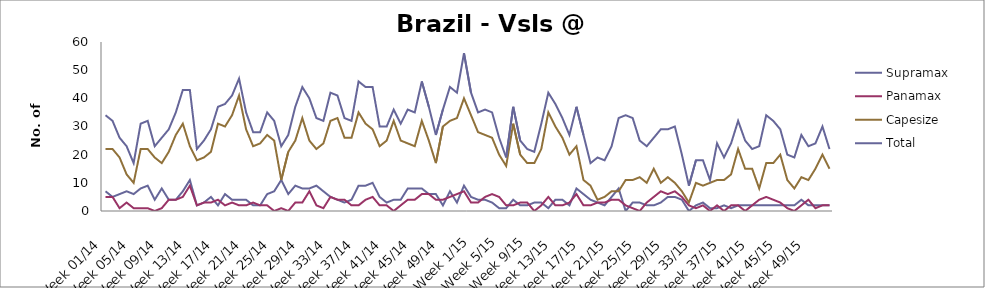
| Category | Supramax | Panamax | Capesize | Total |
|---|---|---|---|---|
| Week 01/14 | 7 | 5 | 22 | 34 |
| Week 02/14 | 5 | 5 | 22 | 32 |
| Week 03/14 | 6 | 1 | 19 | 26 |
| Week 04/14 | 7 | 3 | 13 | 23 |
| Week 05/14 | 6 | 1 | 10 | 17 |
| Week 06/14 | 8 | 1 | 22 | 31 |
| Week 07/14 | 9 | 1 | 22 | 32 |
| Week 08/14 | 4 | 0 | 19 | 23 |
| Week 09/14 | 8 | 1 | 17 | 26 |
| Week 10/14 | 4 | 4 | 21 | 29 |
| Week 11/14 | 4 | 4 | 27 | 35 |
| Week 12/14 | 7 | 5 | 31 | 43 |
| Week 13/14 | 11 | 9 | 23 | 43 |
| Week 14/14 | 2 | 2 | 18 | 22 |
| Week 15/14 | 3 | 3 | 19 | 25 |
| Week 16/14 | 5 | 3 | 21 | 29 |
| Week 17/14 | 2 | 4 | 31 | 37 |
| Week 18/14 | 6 | 2 | 30 | 38 |
| Week 19/14 | 4 | 3 | 34 | 41 |
| Week 20/14 | 4 | 2 | 41 | 47 |
| Week 21/14 | 4 | 2 | 29 | 35 |
| Week 22/14 | 2 | 3 | 23 | 28 |
| Week 23/14 | 2 | 2 | 24 | 28 |
| Week 24/14 | 6 | 2 | 27 | 35 |
| Week 25/14 | 7 | 0 | 25 | 32 |
| Week 26/14 | 11 | 1 | 11 | 23 |
| Week 27/14 | 6 | 0 | 21 | 27 |
| Week 28/14 | 9 | 3 | 25 | 37 |
| Week 29/14 | 8 | 3 | 33 | 44 |
| Week 30/14 | 8 | 7 | 25 | 40 |
| Week 31/14 | 9 | 2 | 22 | 33 |
| Week 32/14 | 7 | 1 | 24 | 32 |
| Week 33/14 | 5 | 5 | 32 | 42 |
| Week 34/14 | 4 | 4 | 33 | 41 |
| Week 35/14 | 3 | 4 | 26 | 33 |
| Week 36/14 | 4 | 2 | 26 | 32 |
| Week 37/14 | 9 | 2 | 35 | 46 |
| Week 38/14 | 9 | 4 | 31 | 44 |
| Week 39/14 | 10 | 5 | 29 | 44 |
| Week 40/14 | 5 | 2 | 23 | 30 |
| Week 41/14 | 3 | 2 | 25 | 30 |
| Week 42/14 | 4 | 0 | 32 | 36 |
| Week 43/14 | 4 | 2 | 25 | 31 |
| Week 44/14 | 8 | 4 | 24 | 36 |
| Week 45/14 | 8 | 4 | 23 | 35 |
| Week 46/14 | 8 | 6 | 32 | 46 |
| Week 47/14 | 6 | 6 | 25 | 37 |
| Week 48/14 | 6 | 4 | 17 | 27 |
| Week 49/14 | 2 | 4 | 30 | 36 |
| Week 50/14 | 7 | 5 | 32 | 44 |
| Week 51/14 | 3 | 6 | 33 | 42 |
| Week 52/14 | 9 | 7 | 40 | 56 |
| Week 1/15 | 5 | 3 | 34 | 42 |
| Week 2/15 | 4 | 3 | 28 | 35 |
| Week 3/15 | 4 | 5 | 27 | 36 |
| Week 4/15 | 3 | 6 | 26 | 35 |
| Week 5/15 | 1 | 5 | 20 | 26 |
| Week 6/15 | 1 | 2 | 16 | 19 |
| Week 7/15 | 4 | 2 | 31 | 37 |
| Week 8/15 | 2 | 3 | 20 | 25 |
| Week 9/15 | 2 | 3 | 17 | 22 |
| Week 10/15 | 3 | 0 | 17 | 21 |
| Week 11/15 | 3 | 2 | 22 | 31 |
| Week 12/15 | 1 | 5 | 35 | 42 |
| Week 13/15 | 4 | 2 | 30 | 38 |
| Week 14/15 | 4 | 2 | 26 | 33 |
| Week 15/15 | 2 | 3 | 20 | 27 |
| Week 16/15 | 8 | 6 | 23 | 37 |
| Week 17/15 | 6 | 2 | 11 | 27 |
| Week 18/15 | 4 | 2 | 9 | 17 |
| Week 19/15 | 3 | 3 | 4 | 19 |
| Week 20/15 | 2 | 3 | 5 | 18 |
| Week 21/15 | 5 | 4 | 7 | 23 |
| Week 22/15 | 8 | 4 | 7 | 33 |
| Week 23/15 | 0 | 2 | 11 | 34 |
| Week 24/15 | 3 | 1 | 11 | 33 |
| Week 25/15 | 3 | 0 | 12 | 25 |
| Week 26/15 | 2 | 3 | 10 | 23 |
| Week 27/15 | 2 | 5 | 15 | 26 |
| Week 28/15 | 3 | 7 | 10 | 29 |
| Week 29/15 | 5 | 6 | 12 | 29 |
| Week 30/15 | 5 | 7 | 10 | 30 |
| Week 31/15 | 4 | 5 | 7 | 20 |
| Week 32/15 | 0 | 2 | 3 | 9 |
| Week 33/15 | 2 | 1 | 10 | 18 |
| Week 34/15 | 3 | 2 | 9 | 18 |
| Week 35/15 | 1 | 0 | 10 | 11 |
| Week 36/15 | 1 | 2 | 11 | 24 |
| Week 37/15 | 2 | 0 | 11 | 19 |
| Week 38/15 | 1 | 2 | 13 | 24 |
| Week 39/15 | 2 | 2 | 22 | 32 |
| Week 40/15 | 2 | 0 | 15 | 25 |
| Week 41/15 | 2 | 2 | 15 | 22 |
| Week 42/15 | 2 | 4 | 8 | 23 |
| Week 43/15 | 2 | 5 | 17 | 34 |
| Week 44/15 | 2 | 4 | 17 | 32 |
| Week 45/15 | 2 | 3 | 20 | 29 |
| Week 46/15 | 2 | 1 | 11 | 20 |
| Week 47/15 | 2 | 0 | 8 | 19 |
| Week 48/15 | 4 | 2 | 12 | 27 |
| Week 49/15 | 2 | 4 | 11 | 23 |
| Week 50/15 | 2 | 1 | 15 | 24 |